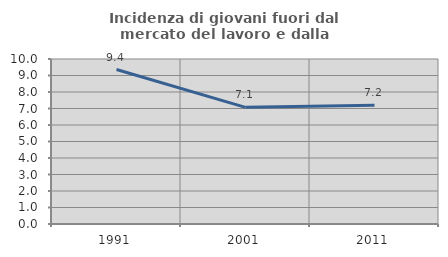
| Category | Incidenza di giovani fuori dal mercato del lavoro e dalla formazione  |
|---|---|
| 1991.0 | 9.363 |
| 2001.0 | 7.069 |
| 2011.0 | 7.192 |